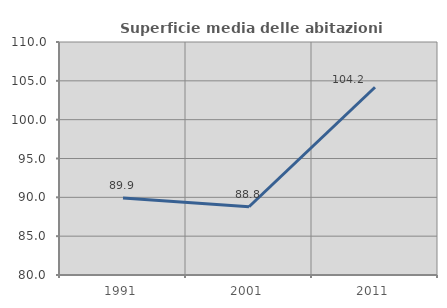
| Category | Superficie media delle abitazioni occupate |
|---|---|
| 1991.0 | 89.913 |
| 2001.0 | 88.787 |
| 2011.0 | 104.178 |